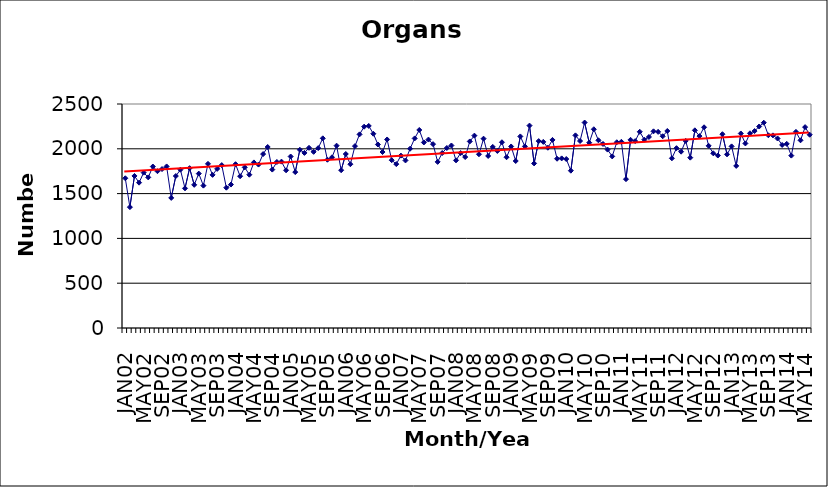
| Category | Series 0 |
|---|---|
| JAN02 | 1671 |
| FEB02 | 1349 |
| MAR02 | 1697 |
| APR02 | 1622 |
| MAY02 | 1734 |
| JUN02 | 1681 |
| JUL02 | 1802 |
| AUG02 | 1750 |
| SEP02 | 1774 |
| OCT02 | 1803 |
| NOV02 | 1452 |
| DEC02 | 1696 |
| JAN03 | 1767 |
| FEB03 | 1559 |
| MAR03 | 1784 |
| APR03 | 1598 |
| MAY03 | 1723 |
| JUN03 | 1589 |
| JUL03 | 1832 |
| AUG03 | 1709 |
| SEP03 | 1776 |
| OCT03 | 1818 |
| NOV03 | 1566 |
| DEC03 | 1601 |
| JAN04 | 1828 |
| FEB04 | 1694 |
| MAR04 | 1793 |
| APR04 | 1711 |
| MAY04 | 1848 |
| JUN04 | 1824 |
| JUL04 | 1941 |
| AUG04 | 2020 |
| SEP04 | 1768 |
| OCT04 | 1853 |
| NOV04 | 1857 |
| DEC04 | 1760 |
| JAN05 | 1914 |
| FEB05 | 1740 |
| MAR05 | 1989 |
| APR05 | 1954 |
| MAY05 | 2011 |
| JUN05 | 1966 |
| JUL05 | 2008 |
| AUG05 | 2117 |
| SEP05 | 1878 |
| OCT05 | 1905 |
| NOV05 | 2035 |
| DEC05 | 1761 |
| JAN06 | 1942 |
| FEB06 | 1828 |
| MAR06 | 2030 |
| APR06 | 2161 |
| MAY06 | 2247 |
| JUN06 | 2255 |
| JUL06 | 2168 |
| AUG06 | 2048 |
| SEP06 | 1964 |
| OCT06 | 2104 |
| NOV06 | 1873 |
| DEC06 | 1829 |
| JAN07 | 1924 |
| FEB07 | 1870 |
| MAR07 | 2001 |
| APR07 | 2116 |
| MAY07 | 2210 |
| JUN07 | 2071 |
| JUL07 | 2103 |
| AUG07 | 2052 |
| SEP07 | 1854 |
| OCT07 | 1953 |
| NOV07 | 2009 |
| DEC07 | 2037 |
| JAN08 | 1871 |
| FEB08 | 1952 |
| MAR08 | 1908 |
| APR08 | 2082 |
| MAY08 | 2147 |
| JUN08 | 1939 |
| JUL08 | 2113 |
| AUG08 | 1920 |
| SEP08 | 2021 |
| OCT08 | 1976 |
| NOV08 | 2073 |
| DEC08 | 1906 |
| JAN09 | 2026 |
| FEB09 | 1864 |
| MAR09 | 2138 |
| APR09 | 2027 |
| MAY09 | 2259 |
| JUN09 | 1837 |
| JUL09 | 2086 |
| AUG09 | 2077 |
| SEP09 | 2012 |
| OCT09 | 2099 |
| NOV09 | 1889 |
| DEC09 | 1893 |
| JAN10 | 1886 |
| FEB10 | 1756 |
| MAR10 | 2150 |
| APR10 | 2087 |
| MAY10 | 2293 |
| JUN10 | 2068 |
| JUL10 | 2218 |
| AUG10 | 2095 |
| SEP10 | 2054 |
| OCT10 | 1991 |
| NOV10 | 1915 |
| DEC10 | 2073 |
| JAN11 | 2078 |
| FEB11 | 1661 |
| MAR11 | 2100 |
| APR11 | 2086 |
| MAY11 | 2190 |
| JUN11 | 2102 |
| JUL11 | 2132 |
| AUG11 | 2195 |
| SEP11 | 2189 |
| OCT11 | 2140 |
| NOV11 | 2199 |
| DEC11 | 1894 |
| JAN12 | 2007 |
| FEB12 | 1968 |
| MAR12 | 2088 |
| APR12 | 1901 |
| MAY12 | 2206 |
| JUN12 | 2142 |
| JUL12 | 2240 |
| AUG12 | 2033 |
| SEP12 | 1950 |
| OCT12 | 1925 |
| NOV12 | 2163 |
| DEC12 | 1938 |
| JAN13 | 2027 |
| FEB13 | 1809 |
| MAR13 | 2171 |
| APR13 | 2060 |
| MAY13 | 2173 |
| JUN13 | 2198 |
| JUL13 | 2249 |
| AUG13 | 2291 |
| SEP13 | 2151 |
| OCT13 | 2150 |
| NOV13 | 2115 |
| DEC13 | 2043 |
| JAN14 | 2055 |
| FEB14 | 1924 |
| MAR14 | 2189 |
| APR14 | 2095 |
| MAY14 | 2242 |
| JUN14 | 2157 |